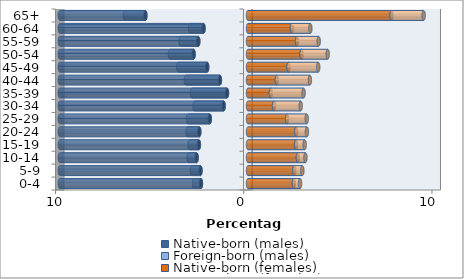
| Category | Native-born (males) | Foreign-born (males) | Native-born (females) | Foreign-born (females) |
|---|---|---|---|---|
| 0-4 | -2.499 | -0.366 | 2.436 | 0.331 |
| 5-9 | -2.524 | -0.462 | 2.459 | 0.427 |
| 10-14 | -2.73 | -0.421 | 2.649 | 0.401 |
| 15-19 | -2.609 | -0.491 | 2.551 | 0.459 |
| 20-24 | -2.586 | -0.623 | 2.563 | 0.568 |
| 25-29 | -2.029 | -1.148 | 2.077 | 1.041 |
| 30-34 | -1.295 | -1.543 | 1.384 | 1.416 |
| 35-39 | -1.117 | -1.856 | 1.212 | 1.74 |
| 40-44 | -1.492 | -1.803 | 1.532 | 1.755 |
| 45-49 | -2.169 | -1.532 | 2.153 | 1.576 |
| 50-54 | -2.891 | -1.253 | 2.844 | 1.39 |
| 55-59 | -2.642 | -0.941 | 2.603 | 1.152 |
| 60-64 | -2.363 | -0.715 | 2.334 | 0.979 |
| 65+ | -5.451 | -1.084 | 7.625 | 1.706 |